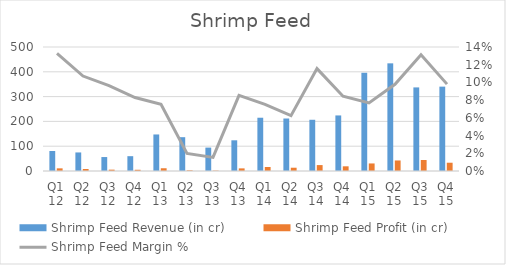
| Category | Shrimp Feed Revenue (in cr) | Shrimp Feed Profit (in cr) |
|---|---|---|
| Q1 12 | 80.63 | 10.7 |
| Q2 12 | 74.82 | 8.02 |
| Q3 12 | 56.27 | 5.42 |
| Q4 12 | 59.77 | 4.96 |
| Q1 13 | 147.32 | 11.1 |
| Q2 13 | 136.34 | 2.71 |
| Q3 13 | 94.39 | 1.45 |
| Q4 13 | 123.81 | 10.57 |
| Q1 14 | 214.81 | 16.18 |
| Q2 14 | 211.67 | 13.22 |
| Q3 14 | 206.56 | 23.87 |
| Q4 14 | 224.05 | 18.91 |
| Q1 15 | 396.05 | 30.44 |
| Q2 15 | 434.12 | 42.49 |
| Q3 15 | 337.07 | 44.27 |
| Q4 15 | 340.2 | 33.37 |